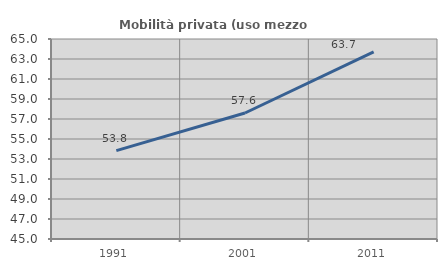
| Category | Mobilità privata (uso mezzo privato) |
|---|---|
| 1991.0 | 53.836 |
| 2001.0 | 57.602 |
| 2011.0 | 63.711 |